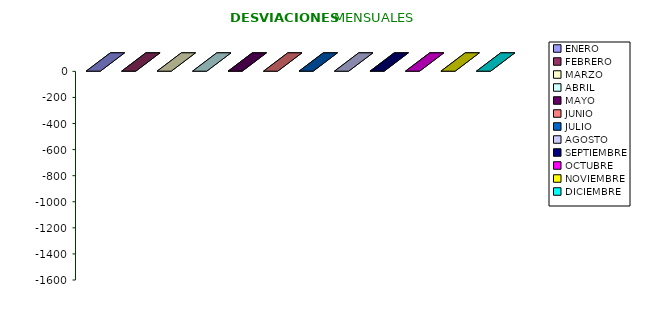
| Category | Series 0 |
|---|---|
| ENERO | 0 |
| FEBRERO | 0 |
| MARZO | 0 |
| ABRIL | 0 |
| MAYO | 0 |
| JUNIO | 0 |
| JULIO | 0 |
| AGOSTO | 0 |
| SEPTIEMBRE | 0 |
| OCTUBRE | 0 |
| NOVIEMBRE | 0 |
| DICIEMBRE | 0 |